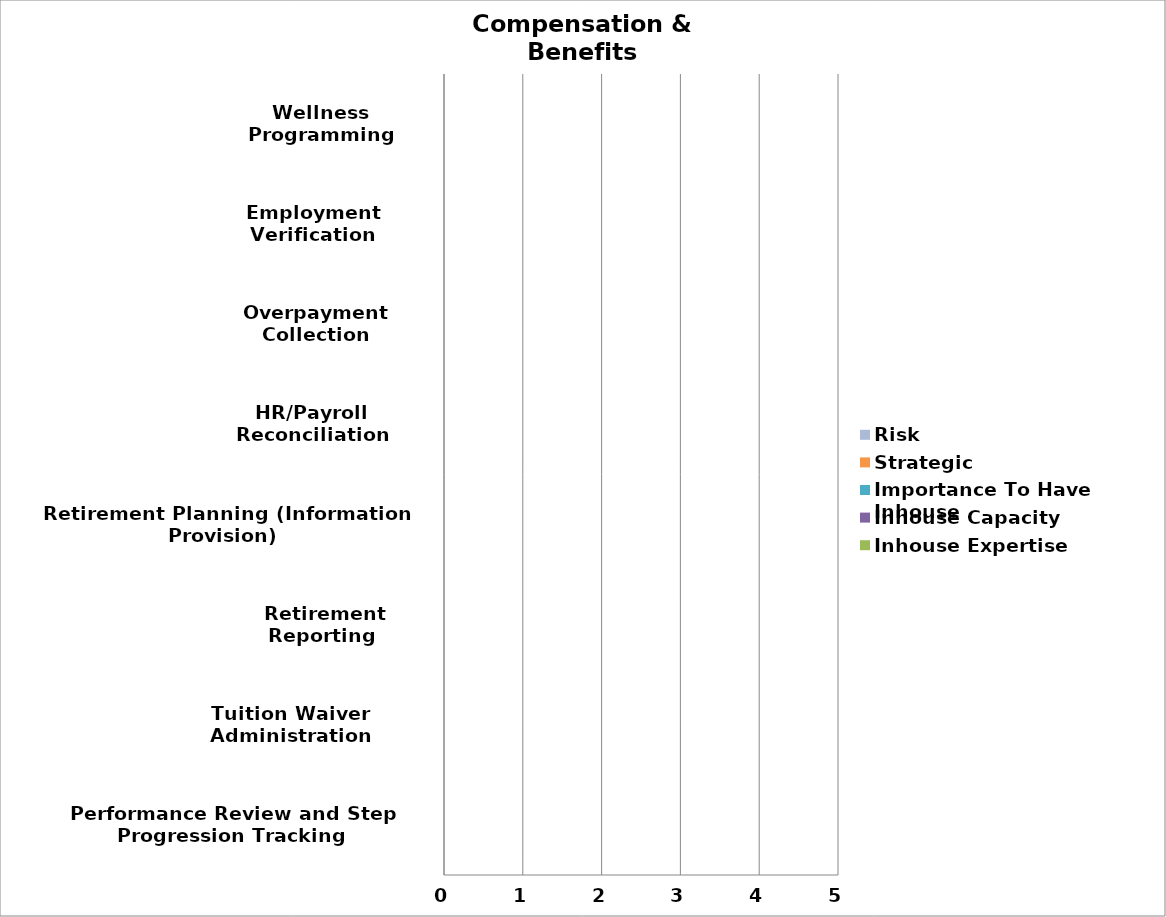
| Category | Inhouse Expertise | Inhouse Capacity | Importance To Have Inhouse | Strategic | Risk |
|---|---|---|---|---|---|
| Performance Review and Step Progression Tracking | 0 | 0 | 0 | 0 | 0 |
| Tuition Waiver Administration | 0 | 0 | 0 | 0 | 0 |
| Retirement Reporting  | 0 | 0 | 0 | 0 | 0 |
| Retirement Planning (Information Provision) | 0 | 0 | 0 | 0 | 0 |
| HR/Payroll Reconciliation | 0 | 0 | 0 | 0 | 0 |
| Overpayment Collection | 0 | 0 | 0 | 0 | 0 |
| Employment Verification | 0 | 0 | 0 | 0 | 0 |
| Wellness Programming | 0 | 0 | 0 | 0 | 0 |